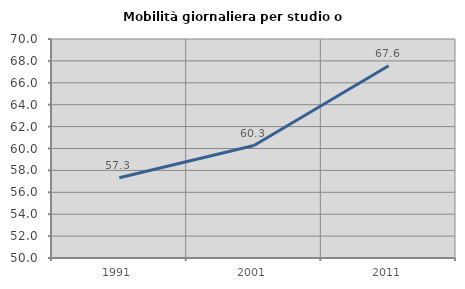
| Category | Mobilità giornaliera per studio o lavoro |
|---|---|
| 1991.0 | 57.333 |
| 2001.0 | 60.27 |
| 2011.0 | 67.557 |